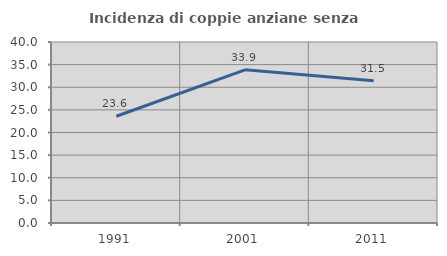
| Category | Incidenza di coppie anziane senza figli  |
|---|---|
| 1991.0 | 23.588 |
| 2001.0 | 33.852 |
| 2011.0 | 31.461 |